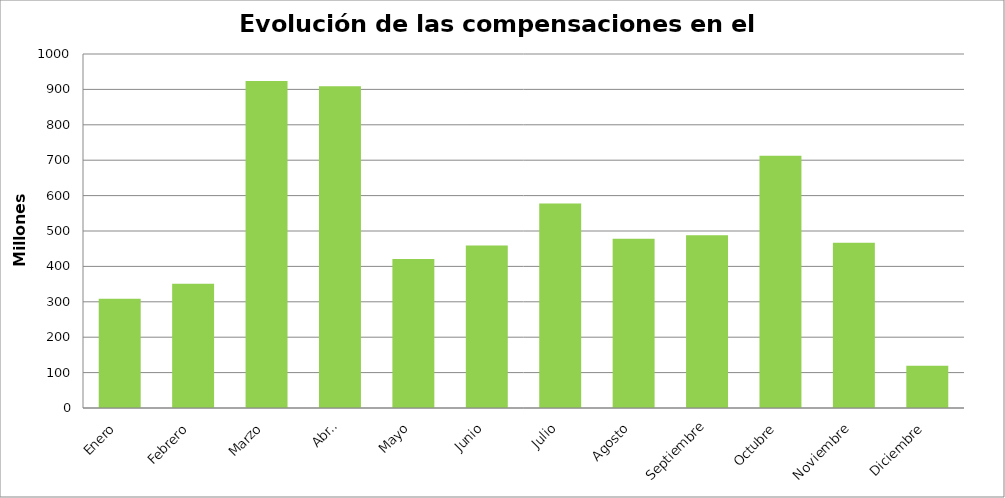
| Category | Series 0 |
|---|---|
| Enero | 308.921 |
| Febrero | 350.638 |
| Marzo | 924.064 |
| Abril | 909.09 |
| Mayo | 420.883 |
| Junio | 459.269 |
| Julio | 577.653 |
| Agosto | 477.872 |
| Septiembre | 487.851 |
| Octubre | 712.915 |
| Noviembre | 466.68 |
| Diciembre | 119.233 |